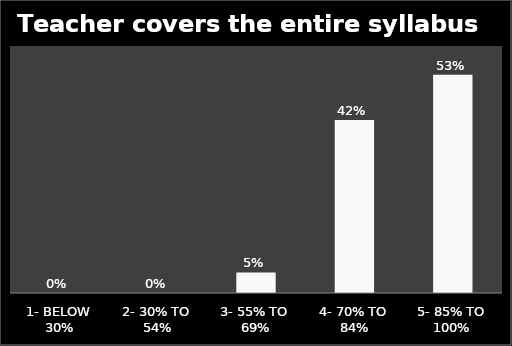
| Category | Series 0 |
|---|---|
| 1- BELOW 30% | 0 |
| 2- 30% TO 54% | 0 |
| 3- 55% TO 69% | 0.05 |
| 4- 70% TO 84% | 0.42 |
| 5- 85% TO 100% | 0.53 |